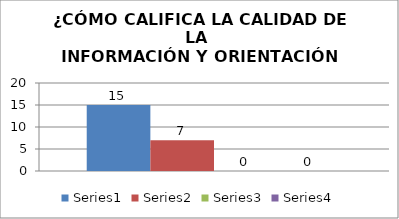
| Category | Series 0 | Series 1 | Series 2 | Series 3 |
|---|---|---|---|---|
| 0 | 15 | 7 | 0 | 0 |